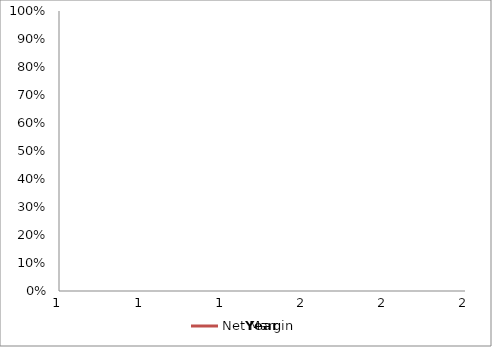
| Category | Net Margin |
|---|---|
| 0 | 0 |
| 1 | 0 |
| 2 | 0 |
| 3 | 0 |
| 4 | 0 |
| 5 | 0 |
| 6 | 0 |
| 7 | 0 |
| 8 | 0 |
| 9 | 0 |